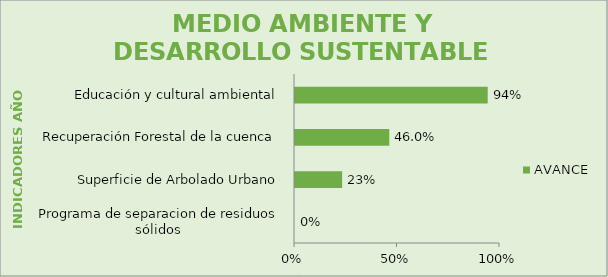
| Category | AVANCE |
|---|---|
| Programa de separacion de residuos sólidos  | 0 |
| Superficie de Arbolado Urbano | 0.23 |
| Recuperación Forestal de la cuenca | 0.46 |
| Educación y cultural ambiental | 0.94 |